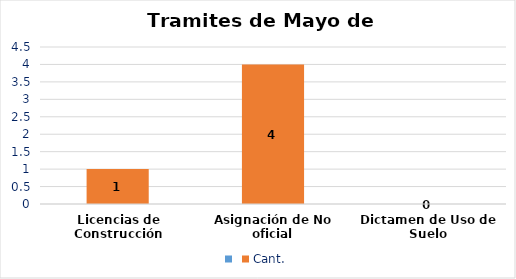
| Category | Series 0 | Cant. |
|---|---|---|
| Licencias de Construcción |  | 1 |
| Asignación de No oficial |  | 4 |
| Dictamen de Uso de Suelo |  | 0 |